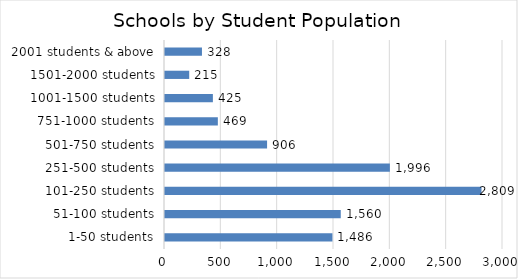
| Category | Series 0 |
|---|---|
| 1-50 students | 1486 |
| 51-100 students | 1560 |
| 101-250 students | 2809 |
| 251-500 students | 1996 |
| 501-750 students | 906 |
| 751-1000 students | 469 |
| 1001-1500 students | 425 |
| 1501-2000 students | 215 |
| 2001 students & above | 328 |